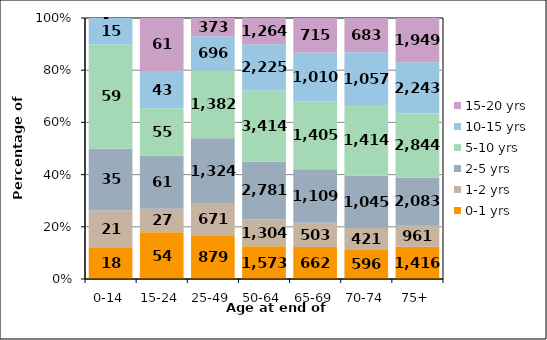
| Category | 0-1 yrs | 1-2 yrs | 2-5 yrs | 5-10 yrs | 10-15 yrs | 15-20 yrs |
|---|---|---|---|---|---|---|
| 0-14 | 18 | 21 | 35 | 59 | 15 | 0 |
| 15-24 | 54 | 27 | 61 | 55 | 43 | 61 |
| 25-49 | 879 | 671 | 1324 | 1382 | 696 | 373 |
| 50-64 | 1573 | 1304 | 2781 | 3414 | 2225 | 1264 |
| 65-69 | 662 | 503 | 1109 | 1405 | 1010 | 715 |
| 70-74 | 596 | 421 | 1045 | 1414 | 1057 | 683 |
| 75+ | 1416 | 961 | 2083 | 2844 | 2243 | 1949 |